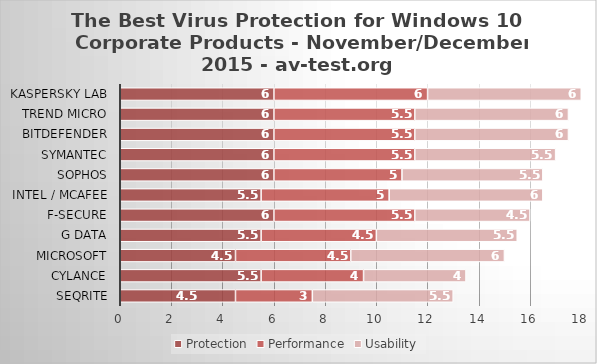
| Category | Protection | Performance | Usability |
|---|---|---|---|
| Seqrite | 4.5 | 3 | 5.5 |
| Cylance | 5.5 | 4 | 4 |
| Microsoft | 4.5 | 4.5 | 6 |
| G Data | 5.5 | 4.5 | 5.5 |
| F-Secure | 6 | 5.5 | 4.5 |
| Intel / McAfee | 5.5 | 5 | 6 |
| Sophos | 6 | 5 | 5.5 |
| Symantec | 6 | 5.5 | 5.5 |
| Bitdefender | 6 | 5.5 | 6 |
| Trend Micro | 6 | 5.5 | 6 |
| Kaspersky Lab | 6 | 6 | 6 |